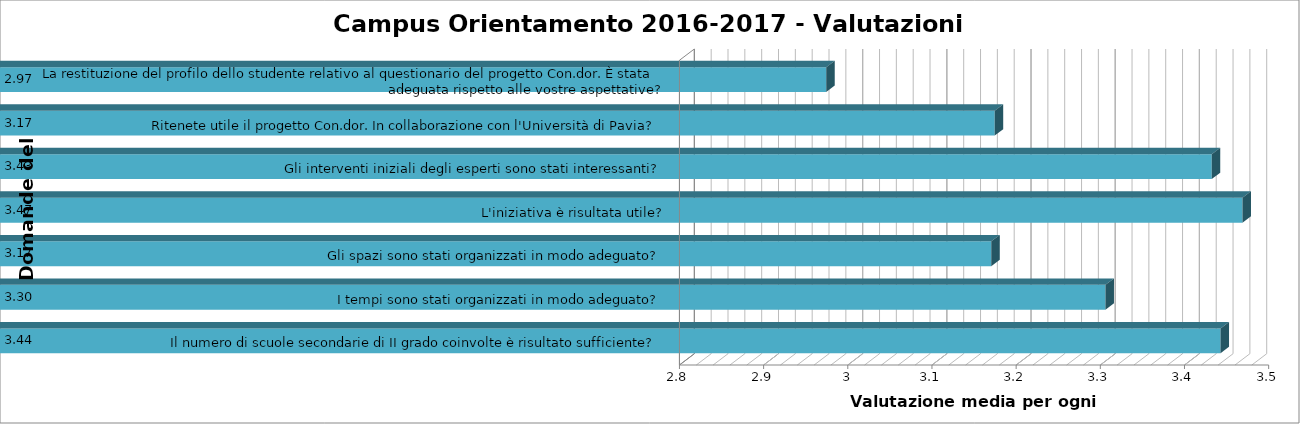
| Category | Series 0 | Series 1 | Series 2 | Series 3 | Series 4 |
|---|---|---|---|---|---|
| Il numero di scuole secondarie di II grado coinvolte è risultato sufficiente? |  |  |  |  | 3.439 |
| I tempi sono stati organizzati in modo adeguato? |  |  |  |  | 3.302 |
| Gli spazi sono stati organizzati in modo adeguato? |  |  |  |  | 3.167 |
| L'iniziativa è risultata utile? |  |  |  |  | 3.465 |
| Gli interventi iniziali degli esperti sono stati interessanti? |  |  |  |  | 3.429 |
| Ritenete utile il progetto Con.dor. In collaborazione con l'Università di Pavia? |  |  |  |  | 3.171 |
| La restituzione del profilo dello studente relativo al questionario del progetto Con.dor. È stata adeguata rispetto alle vostre aspettative? |  |  |  |  | 2.971 |